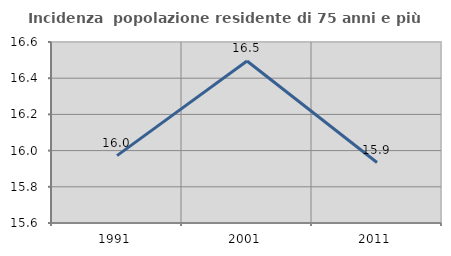
| Category | Incidenza  popolazione residente di 75 anni e più |
|---|---|
| 1991.0 | 15.972 |
| 2001.0 | 16.495 |
| 2011.0 | 15.934 |